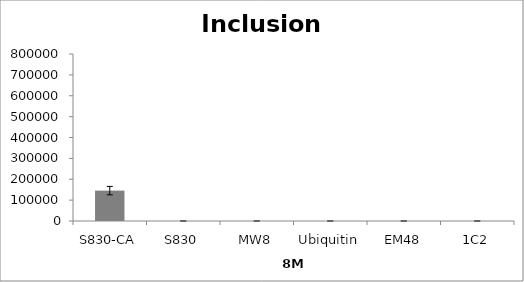
| Category | Series 0 |
|---|---|
| S830-CA | 145544.987 |
| S830 | 0 |
| MW8 | 0 |
| Ubiquitin | 0 |
| EM48 | 0 |
| 1C2 | 0 |